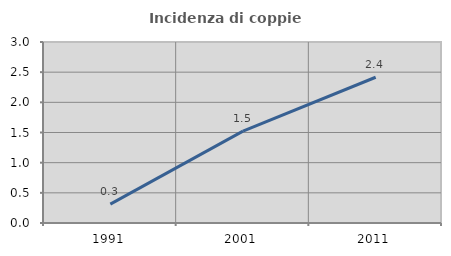
| Category | Incidenza di coppie miste |
|---|---|
| 1991.0 | 0.312 |
| 2001.0 | 1.522 |
| 2011.0 | 2.416 |